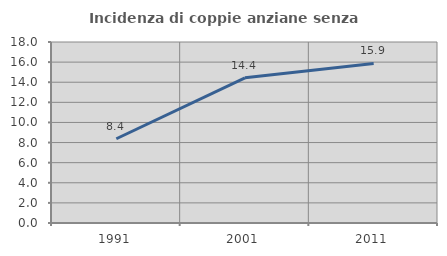
| Category | Incidenza di coppie anziane senza figli  |
|---|---|
| 1991.0 | 8.377 |
| 2001.0 | 14.439 |
| 2011.0 | 15.873 |